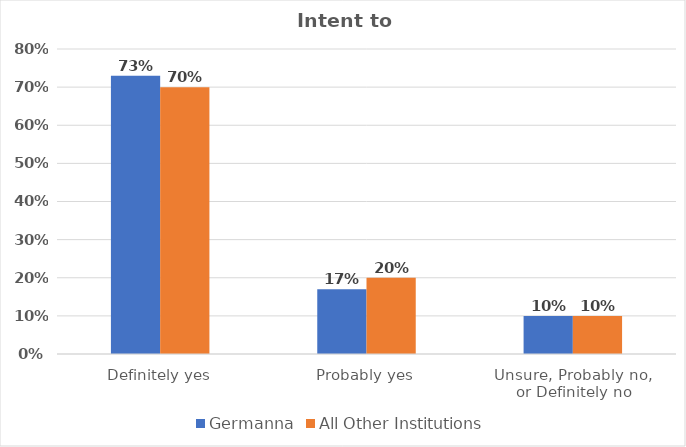
| Category | Germanna | All Other Institutions |
|---|---|---|
| Definitely yes | 0.73 | 0.7 |
| Probably yes | 0.17 | 0.2 |
| Unsure, Probably no, 
or Definitely no | 0.1 | 0.1 |